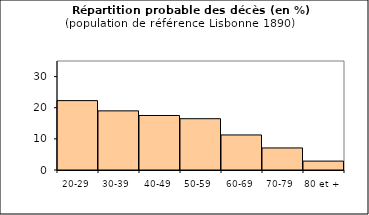
| Category | Series 0 |
|---|---|
| 20-29 | 22.277 |
| 30-39 | 18.988 |
| 40-49 | 17.503 |
| 50-59 | 16.476 |
| 60-69 | 11.258 |
| 70-79 | 7.083 |
| 80 et + | 2.857 |